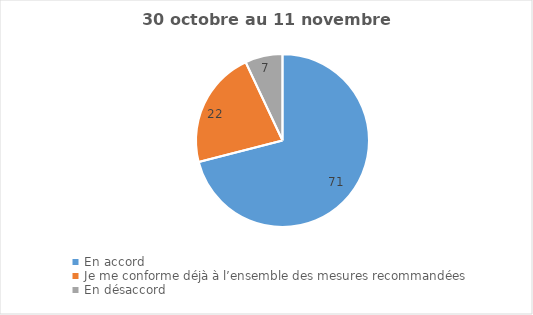
| Category | Series 0 |
|---|---|
| En accord | 71 |
| Je me conforme déjà à l’ensemble des mesures recommandées | 22 |
| En désaccord | 7 |